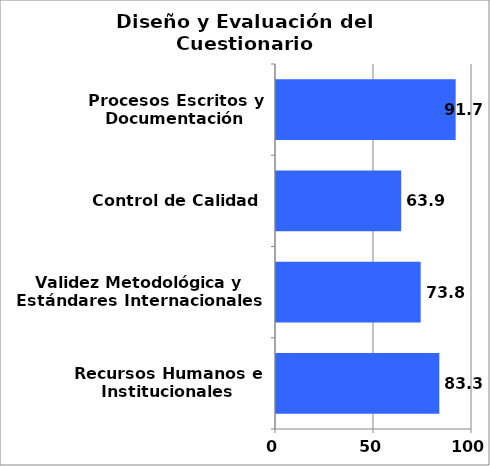
| Category | Series 0 |
|---|---|
| Recursos Humanos e Institucionales | 83.333 |
| Validez Metodológica y Estándares Internacionales | 73.81 |
| Control de Calidad | 63.889 |
| Procesos Escritos y Documentación | 91.667 |